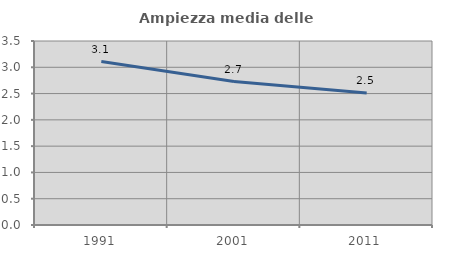
| Category | Ampiezza media delle famiglie |
|---|---|
| 1991.0 | 3.108 |
| 2001.0 | 2.729 |
| 2011.0 | 2.511 |